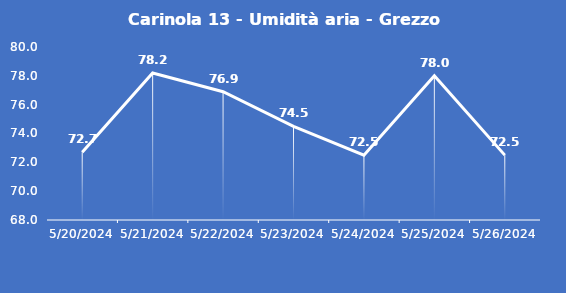
| Category | Carinola 13 - Umidità aria - Grezzo (%) |
|---|---|
| 5/20/24 | 72.7 |
| 5/21/24 | 78.2 |
| 5/22/24 | 76.9 |
| 5/23/24 | 74.5 |
| 5/24/24 | 72.5 |
| 5/25/24 | 78 |
| 5/26/24 | 72.5 |